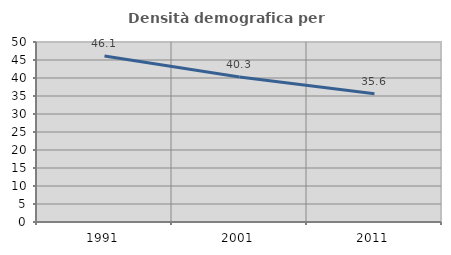
| Category | Densità demografica |
|---|---|
| 1991.0 | 46.134 |
| 2001.0 | 40.29 |
| 2011.0 | 35.6 |